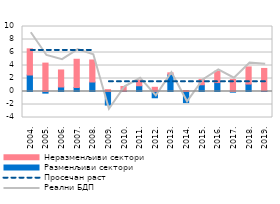
| Category | Разменљиви сектори | Неразменљиви сектори |
|---|---|---|
| 2004. | 2.537 | 4.029 |
| 2005. | -0.252 | 4.37 |
| 2006. | 0.694 | 2.62 |
| 2007. | 0.616 | 4.345 |
| 2008. | 1.461 | 3.387 |
| 2009. | -2.088 | 0.283 |
| 2010. | 0.04 | 0.727 |
| 2011. | 0.885 | 0.848 |
| 2012. | -0.966 | 0.647 |
| 2013. | 2.627 | 0.244 |
| 2014. | -1.707 | 0.158 |
| 2015. | 1.037 | 0.83 |
| 2016. | 1.377 | 1.75 |
| 2017. | -0.102 | 1.859 |
| 2018. | 1.146 | 2.636 |
| 2019. | 0.088 | 3.459 |